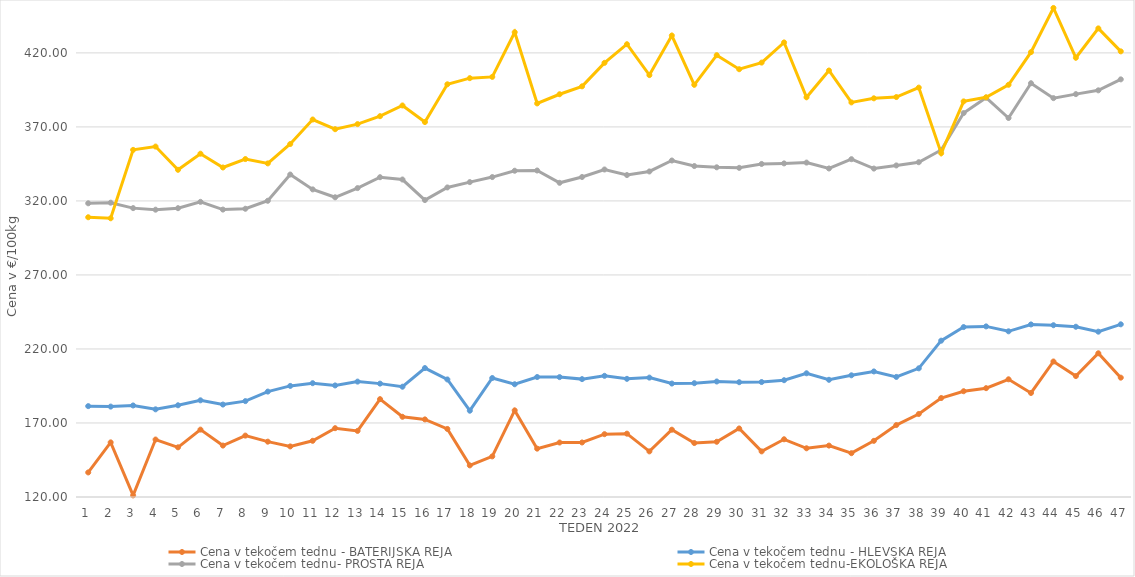
| Category | Cena v tekočem tednu - BATERIJSKA REJA | Cena v tekočem tednu - HLEVSKA REJA | Cena v tekočem tednu- PROSTA REJA | Cena v tekočem tednu-EKOLOŠKA REJA |
|---|---|---|---|---|
| 1.0 | 136.59 | 181.38 | 318.4 | 308.97 |
| 2.0 | 156.88 | 181.07 | 318.82 | 308.28 |
| 3.0 | 121.07 | 181.83 | 315.14 | 354.48 |
| 4.0 | 158.82 | 179.22 | 314.08 | 356.72 |
| 5.0 | 153.55 | 181.96 | 315.1 | 341.03 |
| 6.0 | 165.51 | 185.31 | 319.38 | 351.9 |
| 7.0 | 154.74 | 182.45 | 314.16 | 342.59 |
| 8.0 | 161.48 | 184.77 | 314.71 | 348.28 |
| 9.0 | 157.38 | 191.21 | 320.1 | 345.35 |
| 10.0 | 154.16 | 195.04 | 337.83 | 358.45 |
| 11.0 | 157.96 | 196.88 | 327.79 | 375 |
| 12.0 | 166.49 | 195.36 | 322.46 | 368.45 |
| 13.0 | 164.66 | 197.95 | 328.67 | 371.9 |
| 14.0 | 186.11 | 196.59 | 336.02 | 377.24 |
| 15.0 | 174.18 | 194.49 | 334.46 | 384.48 |
| 16.0 | 172.42 | 207.1 | 320.58 | 373.28 |
| 17.0 | 165.96 | 199.41 | 329.11 | 398.79 |
| 18.0 | 141.36 | 178.29 | 332.71 | 402.93 |
| 19.0 | 147.43 | 200.37 | 336.11 | 403.79 |
| 20.0 | 178.51 | 196.16 | 340.4 | 433.97 |
| 21.0 | 152.67 | 201.05 | 340.55 | 385.86 |
| 22.0 | 156.8 | 200.98 | 332.23 | 392.07 |
| 23.0 | 156.84 | 199.63 | 336.16 | 397.41 |
| 24.0 | 162.44 | 201.86 | 341.24 | 413.28 |
| 25.0 | 162.78 | 199.81 | 337.48 | 425.86 |
| 26.0 | 150.82 | 200.65 | 339.9 | 405 |
| 27.0 | 165.45 | 196.64 | 347.3 | 431.72 |
| 28.0 | 156.46 | 196.88 | 343.56 | 398.45 |
| 29.0 | 157.31 | 198.03 | 342.71 | 418.45 |
| 30.0 | 166.29 | 197.55 | 342.35 | 408.97 |
| 31.0 | 150.81 | 197.66 | 344.97 | 413.45 |
| 32.0 | 158.99 | 198.9 | 345.35 | 427.07 |
| 33.0 | 152.91 | 203.57 | 345.9 | 390 |
| 34.0 | 154.73 | 199.17 | 341.92 | 408.1 |
| 35.0 | 149.6 | 202.21 | 348.2 | 386.55 |
| 36.0 | 157.93 | 204.81 | 341.85 | 389.31 |
| 37.0 | 168.61 | 201.11 | 343.97 | 390.17 |
| 38.0 | 176.07 | 206.91 | 346.16 | 396.55 |
| 39.0 | 186.86 | 225.6 | 354.41 | 352.24 |
| 40.0 | 191.45 | 234.79 | 379.35 | 387.24 |
| 41.0 | 193.52 | 235.24 | 389.75 | 390 |
| 42.0 | 199.51 | 231.92 | 376.02 | 398.45 |
| 43.0 | 190.28 | 236.56 | 399.51 | 420.52 |
| 44.0 | 211.53 | 236.04 | 389.44 | 450.35 |
| 45.0 | 201.69 | 235.01 | 392.15 | 416.72 |
| 46.0 | 217.08 | 231.68 | 394.71 | 436.55 |
| 47.0 | 200.62 | 236.65 | 402.12 | 421.03 |